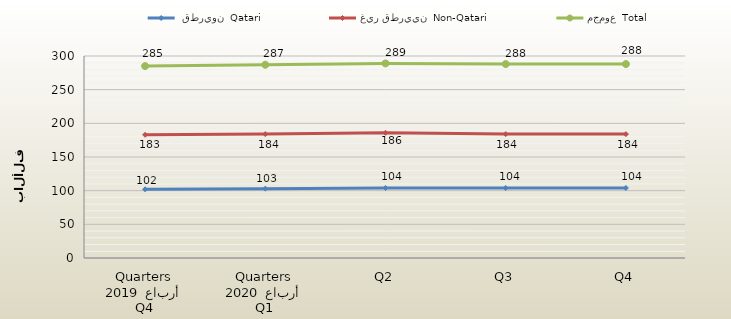
| Category |  قطريون  Qatari | غير قطريين  Non-Qatari | مجموع  Total |
|---|---|---|---|
| 0 | 102 | 183 | 285 |
| 1 | 103 | 184 | 287 |
| 2 | 104 | 186 | 289 |
| 3 | 104 | 184 | 288 |
| 4 | 104 | 184 | 288 |